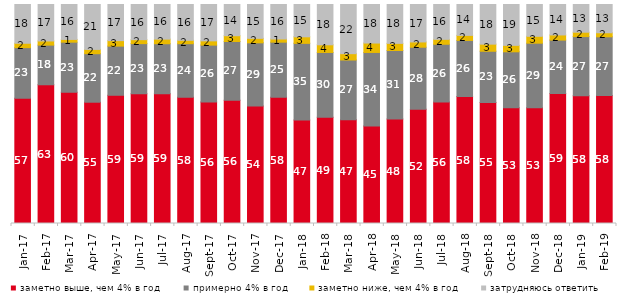
| Category | заметно выше, чем 4% в год | примерно 4% в год | заметно ниже, чем 4% в год | затрудняюсь ответить |
|---|---|---|---|---|
| 2017-01-01 | 57.15 | 23.15 | 2 | 17.7 |
| 2017-02-01 | 63.35 | 18.1 | 1.9 | 16.65 |
| 2017-03-01 | 59.9 | 22.9 | 1.25 | 15.95 |
| 2017-04-01 | 55.35 | 22.15 | 1.95 | 20.5 |
| 2017-05-01 | 58.55 | 22.45 | 2.5 | 16.5 |
| 2017-06-01 | 59.25 | 22.85 | 1.8 | 16.05 |
| 2017-07-01 | 59.2 | 22.85 | 2.1 | 15.8 |
| 2017-08-01 | 57.7 | 24.4 | 1.55 | 16.35 |
| 2017-09-01 | 55.5 | 25.95 | 1.95 | 16.6 |
| 2017-10-01 | 56.3 | 26.8 | 2.65 | 14.25 |
| 2017-11-01 | 53.6 | 28.9 | 2.05 | 15.45 |
| 2017-12-01 | 57.65 | 25.15 | 1.45 | 15.75 |
| 2018-01-01 | 47.25 | 35 | 3 | 14.75 |
| 2018-02-01 | 48.5 | 29.6 | 3.5 | 18.4 |
| 2018-03-01 | 47.4 | 27.25 | 2.9 | 22.45 |
| 2018-04-01 | 44.55 | 33.55 | 4.3 | 17.6 |
| 2018-05-01 | 47.7 | 31.3 | 3.25 | 17.75 |
| 2018-06-01 | 52.2 | 28.3 | 2.4 | 17.1 |
| 2018-07-01 | 55.5 | 26.35 | 2.25 | 15.9 |
| 2018-08-01 | 57.95 | 25.65 | 2.3 | 14.1 |
| 2018-09-01 | 55.3 | 23.35 | 3.25 | 18.1 |
| 2018-10-01 | 52.85 | 25.55 | 2.95 | 18.65 |
| 2018-11-01 | 52.844 | 29.491 | 3.144 | 14.521 |
| 2018-12-01 | 59.4 | 24.35 | 2.35 | 13.9 |
| 2019-01-01 | 58.3 | 27.05 | 2 | 12.65 |
| 2019-02-01 | 58.45 | 26.8 | 1.85 | 12.9 |